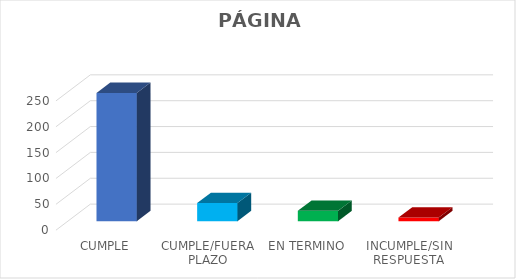
| Category | TOTAL |
|---|---|
| CUMPLE | 248 |
| CUMPLE/FUERA PLAZO | 35 |
| EN TERMINO | 20 |
| INCUMPLE/SIN RESPUESTA | 7 |